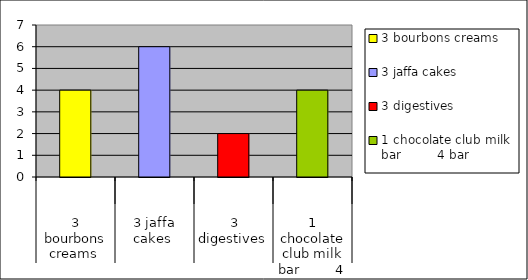
| Category | Series 0 |
|---|---|
| 0 | 4 |
| 1 | 6 |
| 2 | 2 |
| 3 | 4 |